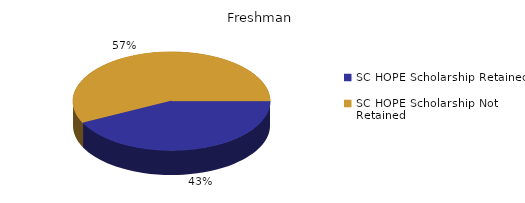
| Category | Freshman |
|---|---|
| SC HOPE Scholarship Retained  | 154 |
| SC HOPE Scholarship Not Retained  | 207 |